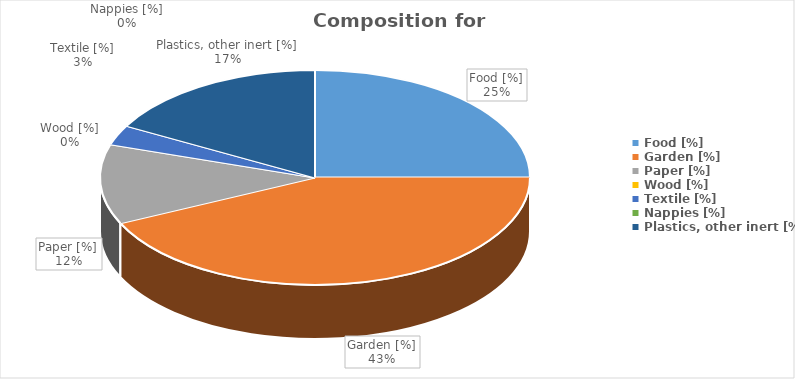
| Category | Series 0 |
|---|---|
| Food [%] | 25 |
| Garden [%] | 43 |
| Paper [%] | 12 |
| Wood [%] | 0 |
| Textile [%] | 3 |
| Nappies [%] | 0 |
| Plastics, other inert [%] | 17 |